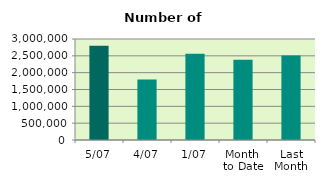
| Category | Series 0 |
|---|---|
| 5/07 | 2796280 |
| 4/07 | 1797724 |
| 1/07 | 2562568 |
| Month 
to Date | 2385524 |
| Last
Month | 2507488.545 |